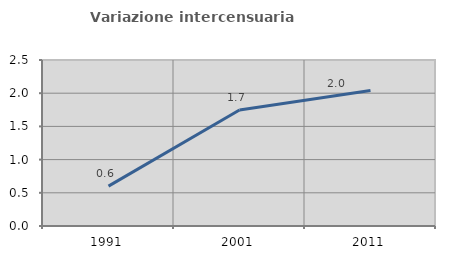
| Category | Variazione intercensuaria annua |
|---|---|
| 1991.0 | 0.6 |
| 2001.0 | 1.746 |
| 2011.0 | 2.04 |